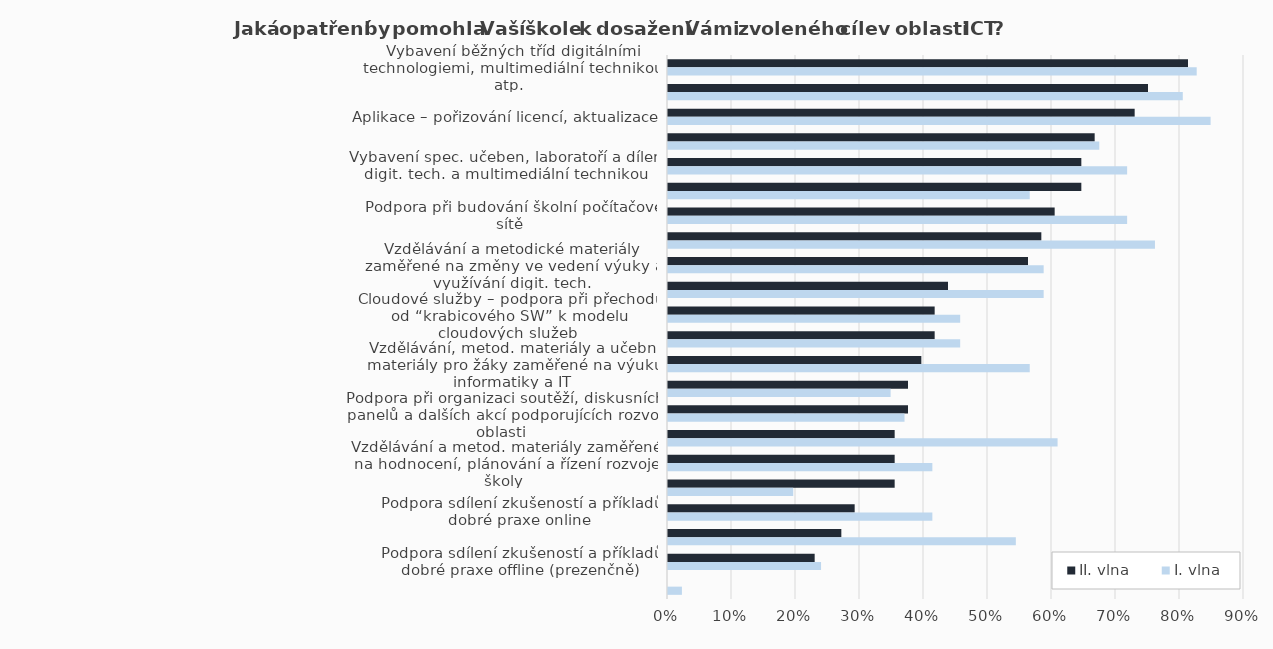
| Category | II. vlna | I. vlna |
|---|---|---|
| Vybavení běžných tříd digitálními technologiemi, multimediální technikou atp. | 0.812 | 0.826 |
| Vybavení ICT učeben digitálními technologiemi, multimediální technikou atp. | 0.75 | 0.804 |
| Aplikace – pořizování licencí, aktualizace | 0.729 | 0.848 |
| Technická podpora - správa sítě, provoz a údržba zařízení, aktualizace a upgrady, audity | 0.667 | 0.674 |
| Vybavení spec. učeben, laboratoří a dílen digit. tech. a multimediální technikou | 0.646 | 0.717 |
| Vzdělávání zaměřené na práci s novými technologiemi, seznámení s novými službami, SW a HW | 0.646 | 0.565 |
| Podpora při budování školní počítačové sítě | 0.604 | 0.717 |
| Vysokorychlostní připojení školy k internetu | 0.583 | 0.761 |
| Vzdělávání a metodické materiály zaměřené na změny ve vedení výuky a využívání digit. tech. | 0.562 | 0.587 |
| Podpora při budování školních platforem pro šíření a sdílení informací (informační systém, web) | 0.438 | 0.587 |
| Cloudové služby – podpora při přechodu od “krabicového SW” k modelu cloudových služeb | 0.417 | 0.457 |
| Nabídka dalšího vzdělávání učitelů v oblasti rozvoje digit. kompetencí a inform. myšlení žáků | 0.417 | 0.457 |
| Vzdělávání, metod. materiály a učební materiály pro žáky zaměřené na výuku informatiky a IT | 0.396 | 0.565 |
| Propojování výuky s odborníky z praxe | 0.375 | 0.348 |
| Podpora při organizaci soutěží, diskusních panelů a dalších akcí podporujících rozvoj oblasti | 0.375 | 0.37 |
| Vzdělávání, metod. a učební materiály pro žáky zaměřené na rozvoj digit. gramotnosti | 0.354 | 0.609 |
| Vzdělávání a metod. materiály zaměřené na hodnocení, plánování a řízení rozvoje školy | 0.354 | 0.413 |
| ICT asistent učitele do výuky | 0.354 | 0.196 |
| Podpora sdílení zkušeností a příkladů dobré praxe online | 0.292 | 0.413 |
| Podpora při organizaci exkurzí a stáží | 0.271 | 0.543 |
| Podpora sdílení zkušeností a příkladů dobré praxe offline (prezenčně) | 0.229 | 0.239 |
| Jiné | 0 | 0.022 |